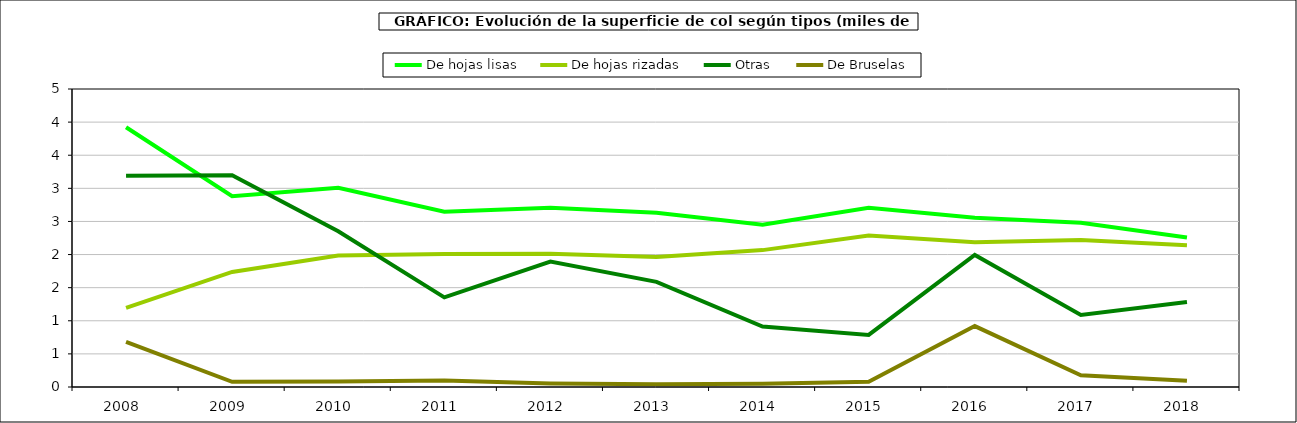
| Category | De hojas lisas | De hojas rizadas | Otras | De Bruselas |
|---|---|---|---|---|
| 2008.0 | 3.923 | 1.194 | 3.189 | 0.682 |
| 2009.0 | 2.882 | 1.738 | 3.197 | 0.078 |
| 2010.0 | 3.008 | 1.987 | 2.352 | 0.083 |
| 2011.0 | 2.648 | 2.008 | 1.354 | 0.098 |
| 2012.0 | 2.707 | 2.014 | 1.895 | 0.053 |
| 2013.0 | 2.631 | 1.962 | 1.588 | 0.043 |
| 2014.0 | 2.45 | 2.067 | 0.914 | 0.048 |
| 2015.0 | 2.707 | 2.288 | 0.786 | 0.08 |
| 2016.0 | 2.557 | 2.186 | 1.994 | 0.92 |
| 2017.0 | 2.479 | 2.218 | 1.087 | 0.178 |
| 2018.0 | 2.257 | 2.141 | 1.282 | 0.094 |